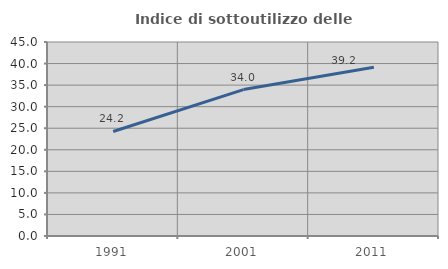
| Category | Indice di sottoutilizzo delle abitazioni  |
|---|---|
| 1991.0 | 24.249 |
| 2001.0 | 33.962 |
| 2011.0 | 39.163 |